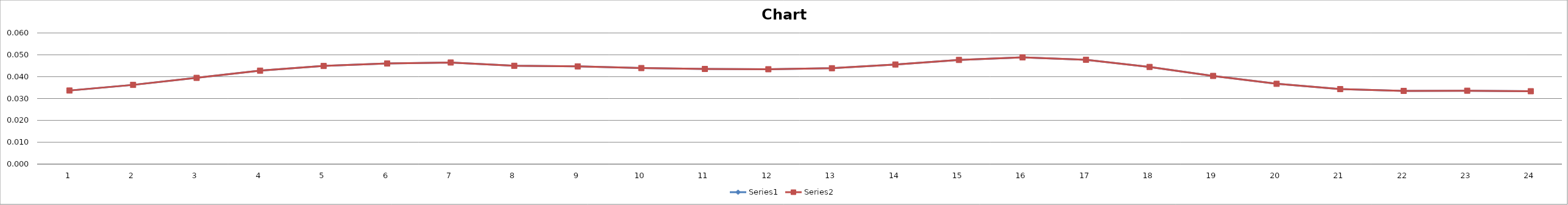
| Category | Series 0 | Series 1 |
|---|---|---|
| 0 | 0.034 | 0.034 |
| 1 | 0.036 | 0.036 |
| 2 | 0.039 | 0.039 |
| 3 | 0.043 | 0.043 |
| 4 | 0.045 | 0.045 |
| 5 | 0.046 | 0.046 |
| 6 | 0.046 | 0.046 |
| 7 | 0.045 | 0.045 |
| 8 | 0.045 | 0.045 |
| 9 | 0.044 | 0.044 |
| 10 | 0.044 | 0.044 |
| 11 | 0.043 | 0.043 |
| 12 | 0.044 | 0.044 |
| 13 | 0.046 | 0.046 |
| 14 | 0.048 | 0.048 |
| 15 | 0.049 | 0.049 |
| 16 | 0.048 | 0.048 |
| 17 | 0.044 | 0.044 |
| 18 | 0.04 | 0.04 |
| 19 | 0.037 | 0.037 |
| 20 | 0.034 | 0.034 |
| 21 | 0.033 | 0.033 |
| 22 | 0.034 | 0.034 |
| 23 | 0.033 | 0.033 |